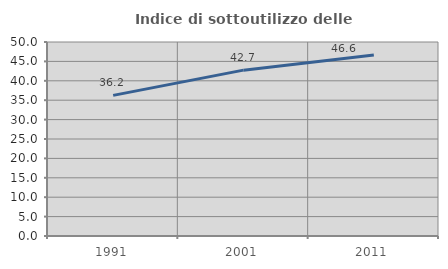
| Category | Indice di sottoutilizzo delle abitazioni  |
|---|---|
| 1991.0 | 36.243 |
| 2001.0 | 42.748 |
| 2011.0 | 46.635 |